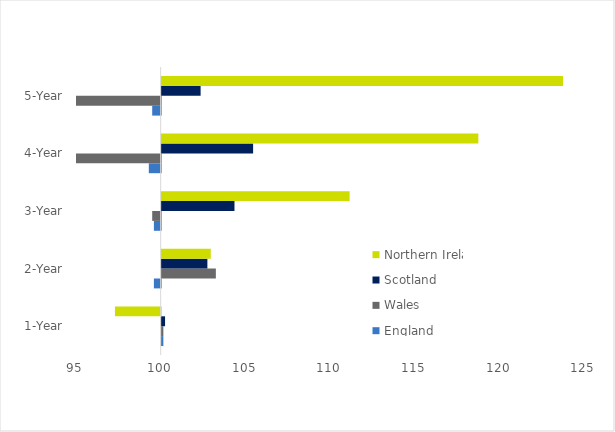
| Category | England | Wales | Scotland | Northern Ireland |
|---|---|---|---|---|
| 1-Year | 100.1 | 100.1 | 100.2 | 97.3 |
| 2-Year | 99.6 | 103.2 | 102.7 | 102.9 |
| 3-Year | 99.6 | 99.5 | 104.3 | 111.1 |
| 4-Year | 99.3 | 93.9 | 105.4 | 118.7 |
| 5-Year | 99.5 | 94.2 | 102.3 | 123.7 |